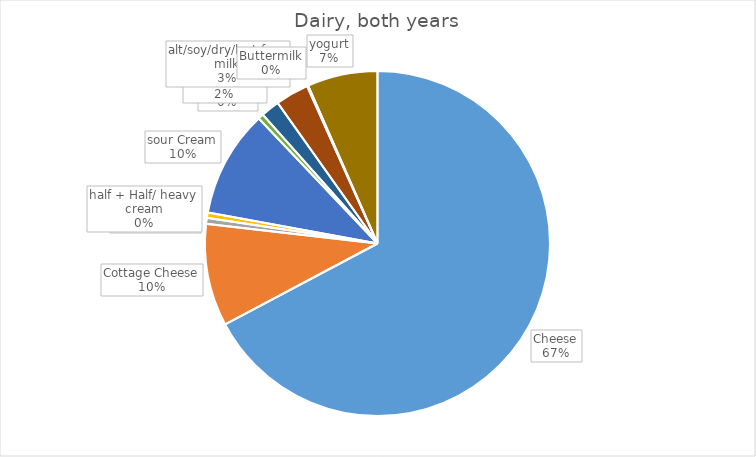
| Category | Series 0 |
|---|---|
| Cheese | 154260.23 |
| Cottage Cheese | 22016.81 |
| cream cheese | 1275.04 |
| half + Half/ heavy cream | 1156.29 |
| sour Cream | 23011.94 |
| Ice Cram | 1160.82 |
| Milk Gal/bulk | 4029.15 |
| alt/soy/dry/lact free milk | 7178.84 |
| Buttermilk | 253.12 |
| yogurt | 15116.68 |